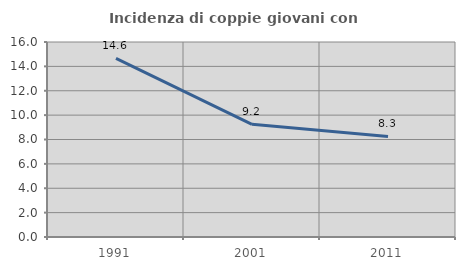
| Category | Incidenza di coppie giovani con figli |
|---|---|
| 1991.0 | 14.649 |
| 2001.0 | 9.246 |
| 2011.0 | 8.254 |